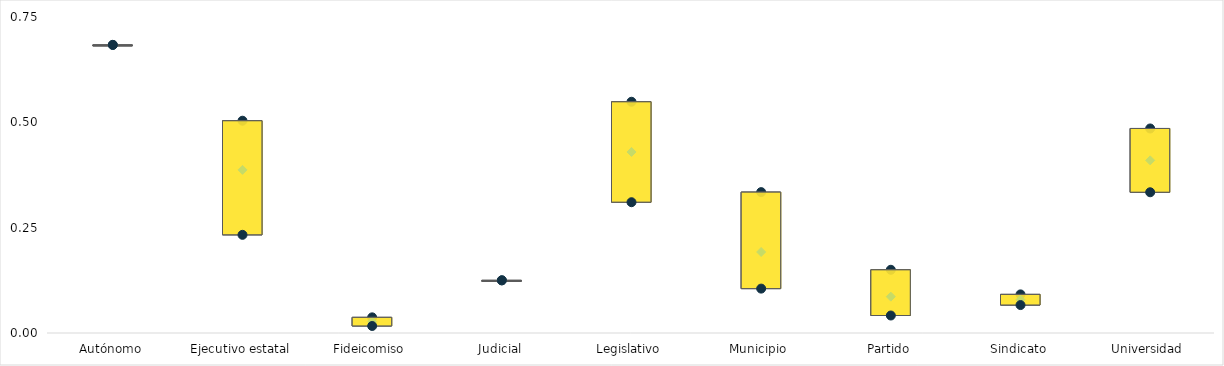
| Category | Máx. de GA | Promedio de GA2 | Mín. de GA3 |
|---|---|---|---|
| Autónomo | 0.684 | 0.684 | 0.684 |
| Ejecutivo estatal | 0.504 | 0.387 | 0.233 |
| Fideicomiso | 0.037 | 0.027 | 0.017 |
| Judicial | 0.125 | 0.125 | 0.125 |
| Legislativo | 0.549 | 0.43 | 0.31 |
| Municipio | 0.334 | 0.192 | 0.105 |
| Partido | 0.15 | 0.086 | 0.042 |
| Sindicato | 0.092 | 0.079 | 0.066 |
| Universidad | 0.485 | 0.41 | 0.334 |